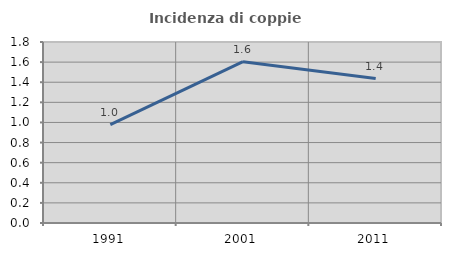
| Category | Incidenza di coppie miste |
|---|---|
| 1991.0 | 0.978 |
| 2001.0 | 1.604 |
| 2011.0 | 1.437 |